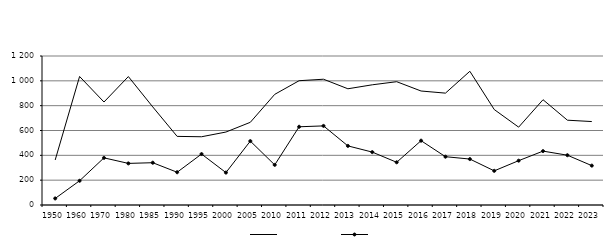
| Category | Series 0 | Series 1 |
|---|---|---|
| 1950.0 | 362.542 | 52.816 |
| 1960.0 | 1035.058 | 195.09 |
| 1970.0 | 829.395 | 379.697 |
| 1980.0 | 1034.382 | 334.989 |
| 1985.0 | 789.908 | 340.578 |
| 1990.0 | 552.675 | 263.784 |
| 1995.0 | 549.615 | 410.259 |
| 2000.0 | 587.597 | 261.053 |
| 2005.0 | 665.983 | 514.588 |
| 2010.0 | 891 | 323 |
| 2011.0 | 1001 | 630 |
| 2012.0 | 1013 | 637 |
| 2013.0 | 936 | 476 |
| 2014.0 | 968 | 426 |
| 2015.0 | 993 | 344 |
| 2016.0 | 918 | 518 |
| 2017.0 | 901 | 389 |
| 2018.0 | 1077 | 370 |
| 2019.0 | 769 | 275 |
| 2020.0 | 627 | 357 |
| 2021.0 | 848 | 434 |
| 2022.0 | 683 | 401 |
| 2023.0 | 672 | 317 |